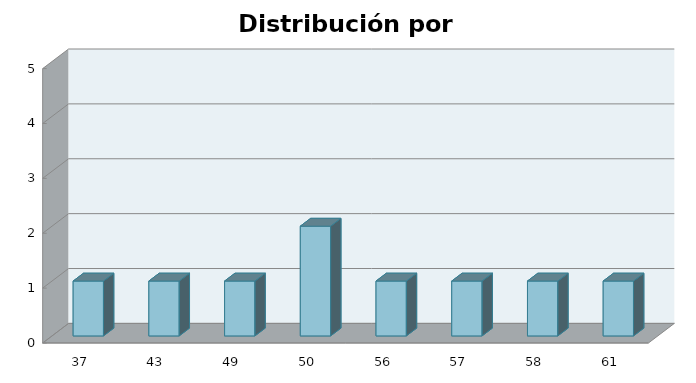
| Category | Series 1 |
|---|---|
| 37.0 | 1 |
| 43.0 | 1 |
| 49.0 | 1 |
| 50.0 | 2 |
| 56.0 | 1 |
| 57.0 | 1 |
| 58.0 | 1 |
| 61.0 | 1 |